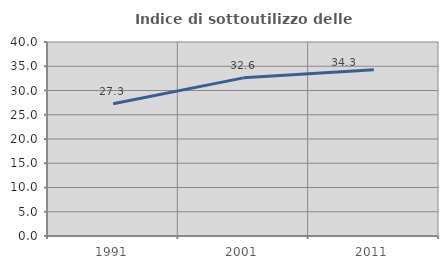
| Category | Indice di sottoutilizzo delle abitazioni  |
|---|---|
| 1991.0 | 27.273 |
| 2001.0 | 32.609 |
| 2011.0 | 34.262 |